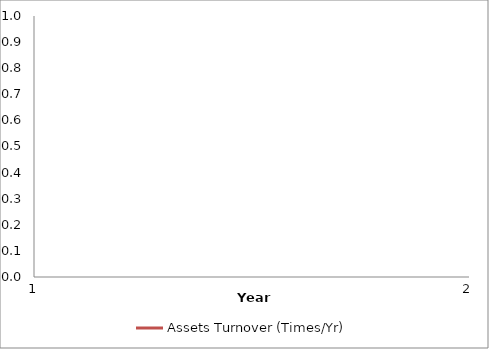
| Category | Assets Turnover (Times/Yr) |
|---|---|
| 0 | 0 |
| 1 | 0 |
| 2 | 0 |
| 3 | 0 |
| 4 | 0 |
| 5 | 0 |
| 6 | 0 |
| 7 | 0 |
| 8 | 0 |
| 9 | 0 |